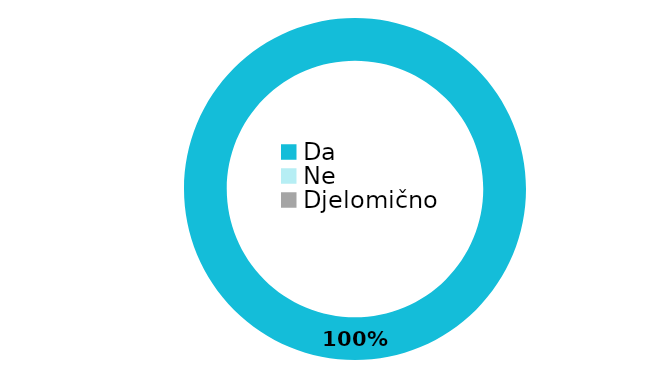
| Category | Series 0 |
|---|---|
| Da | 54 |
| Ne | 0 |
| Djelomično | 0 |